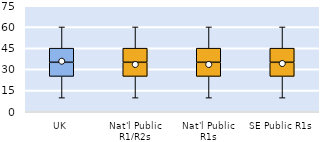
| Category | 25th | 50th | 75th |
|---|---|---|---|
| UK | 25 | 10 | 10 |
| Nat'l Public R1/R2s | 25 | 10 | 10 |
| Nat'l Public R1s | 25 | 10 | 10 |
| SE Public R1s | 25 | 10 | 10 |